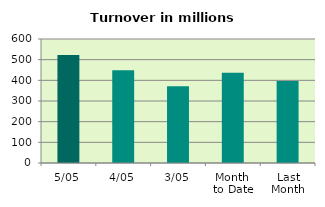
| Category | Series 0 |
|---|---|
| 5/05 | 522.076 |
| 4/05 | 448.59 |
| 3/05 | 371.153 |
| Month 
to Date | 437.166 |
| Last
Month | 396.429 |